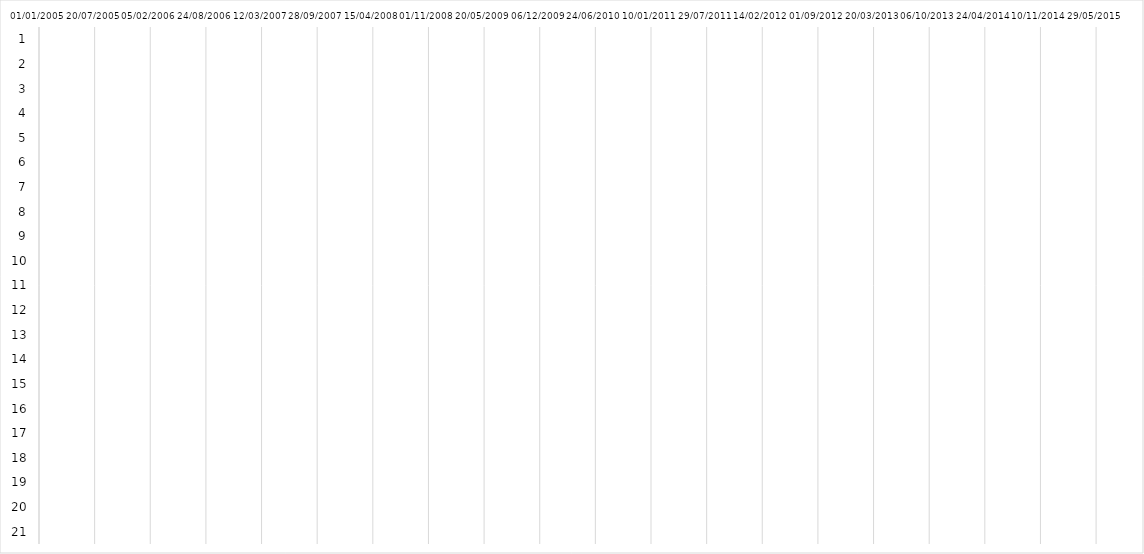
| Category | A |
|---|---|
| 0 | 0 |
| 1 | 0 |
| 2 | 0 |
| 3 | 0 |
| 4 | 0 |
| 5 | 0 |
| 6 | 0 |
| 7 | 0 |
| 8 | 0 |
| 9 | 0 |
| 10 | 0 |
| 11 | 0 |
| 12 | 0 |
| 13 | 0 |
| 14 | 0 |
| 15 | 0 |
| 16 | 0 |
| 17 | 0 |
| 18 | 0 |
| 19 | 0 |
| 20 | 0 |